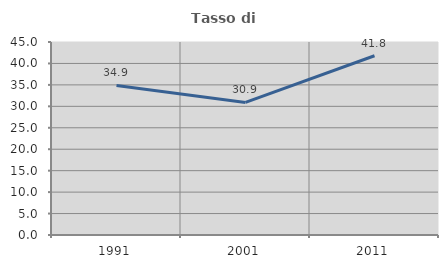
| Category | Tasso di occupazione   |
|---|---|
| 1991.0 | 34.861 |
| 2001.0 | 30.911 |
| 2011.0 | 41.8 |